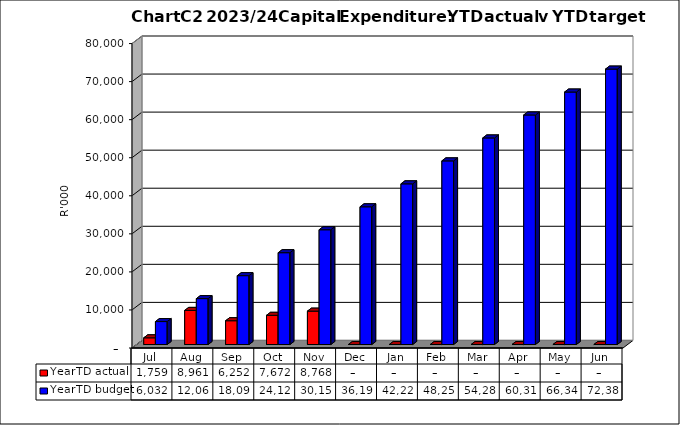
| Category | YearTD actual | YearTD budget |
|---|---|---|
| Jul | 1759374.9 | 6031706 |
| Aug | 8961182.31 | 12063412 |
| Sep | 6251636.02 | 18095118 |
| Oct | 7671938.68 | 24126824 |
| Nov | 8768380.14 | 30158530 |
| Dec | 0 | 36190236 |
| Jan | 0 | 42221942 |
| Feb | 0 | 48253648 |
| Mar | 0 | 54285354 |
| Apr | 0 | 60317060 |
| May | 0 | 66348766 |
| Jun | 0 | 72380350 |